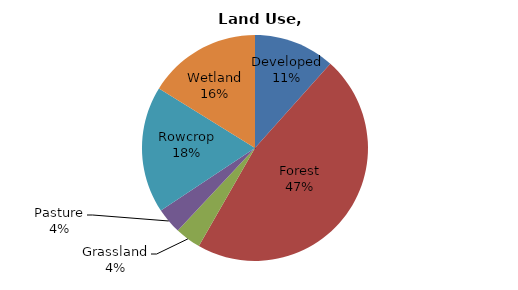
| Category | Series 0 |
|---|---|
| Developed | 249.719 |
| Forest | 1003.578 |
| Grassland | 79.586 |
| Pasture | 79.625 |
| Rowcrop | 390.484 |
| Wetland | 347.749 |